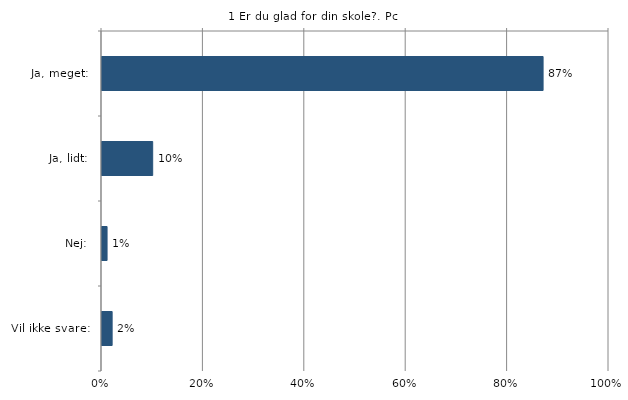
| Category | Er du glad for din skole? |
|---|---|
| Ja, meget:  | 0.87 |
| Ja, lidt:  | 0.1 |
| Nej:  | 0.01 |
| Vil ikke svare:  | 0.02 |